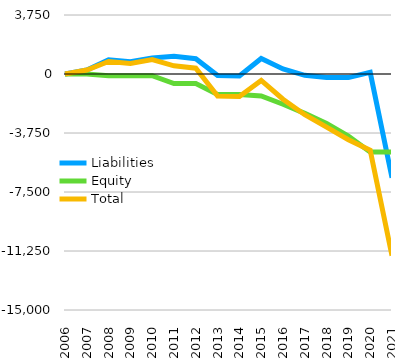
| Category | Liabilities  | Equity  | Total |
|---|---|---|---|
| 2006 | 0 | 0 | 0 |
| 2007 | 254 | 0 | 254 |
| 2008 | 900 | -104 | 796 |
| 2009 | 779 | -104 | 675 |
| 2010 | 1022 | -104 | 918 |
| 2011 | 1123 | -604 | 519 |
| 2012 | 971 | -604 | 367 |
| 2013 | -100 | -1297 | -1397 |
| 2014 | -128 | -1297 | -1425 |
| 2015 | 988 | -1397 | -409 |
| 2016 | 318 | -1923 | -1605 |
| 2017 | -85 | -2502 | -2587 |
| 2018 | -229 | -3152 | -3381 |
| 2019 | -229 | -3952 | -4181 |
| 2020 | 102 | -4953 | -4851 |
| 2021 | -6593 | -4953 | -11546 |